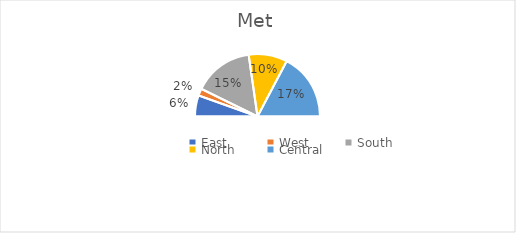
| Category | Met |
|---|---|
| East | 6 |
| West | 2 |
| South | 17 |
| North | 11 |
| Central | 19 |
| Total | 55 |